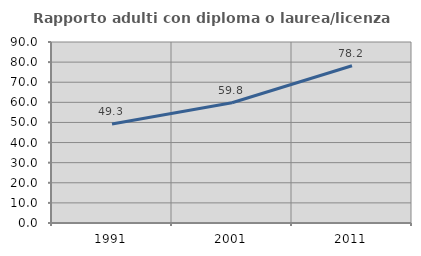
| Category | Rapporto adulti con diploma o laurea/licenza media  |
|---|---|
| 1991.0 | 49.275 |
| 2001.0 | 59.794 |
| 2011.0 | 78.169 |